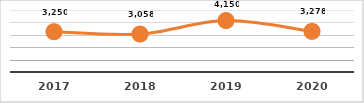
| Category | SERVICIOS TECNOLÓGICOS PROPORCIONADOS
PRIMER TRIMESTRE, EJERCICIO 2020 |
|---|---|
| 2017.0 | 3250 |
| 2018.0 | 3058 |
| 2019.0 | 4150 |
| 2020.0 | 3278 |